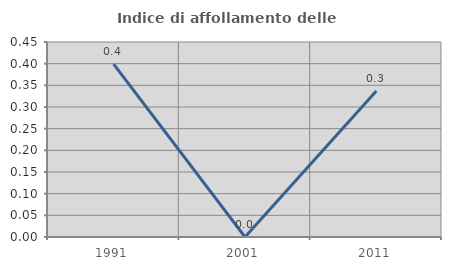
| Category | Indice di affollamento delle abitazioni  |
|---|---|
| 1991.0 | 0.399 |
| 2001.0 | 0 |
| 2011.0 | 0.337 |